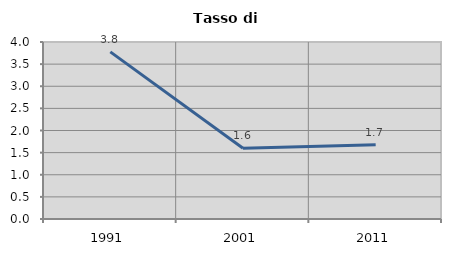
| Category | Tasso di disoccupazione   |
|---|---|
| 1991.0 | 3.776 |
| 2001.0 | 1.6 |
| 2011.0 | 1.68 |